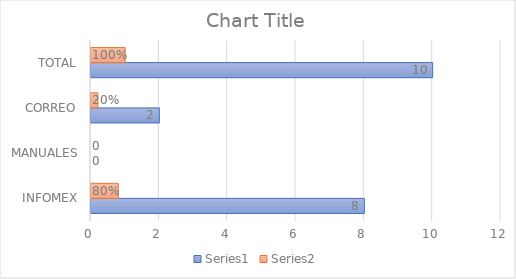
| Category | Series 0 | Series 1 |
|---|---|---|
| INFOMEX | 8 | 0.8 |
| MANUALES | 0 | 0 |
| CORREO | 2 | 0.2 |
| TOTAL | 10 | 1 |